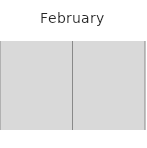
| Category | 1 | Fill 1 | 2 | Fill 2 | 3 | Fill 3 | 4 | Fill 4 | 5 | Fill 5 | 6 | Fill 6 | 7 | Fill 7 | 8 | Fill 8 | 9 | Fill 9 | 10 | Fill 10 | 11 | Fill 11 | 12 | Fill 12 | 13 | Fill 13 | 14 | Fill 14 | 15 | Fill 15 | 16 | Fill 16 | 17 | Fill 17 | 18 | Fill 18 | 19 | Fill 19 | 20 | Fill 20 | 21 | Fill 21 | 22 | Fill 22 | 23 | Fill 23 | 24 | Fill 24 | 25 | Fill 25 | 26 | Fill 26 | 27 | Fill 27 | 28 | Fill 28 |
|---|---|---|---|---|---|---|---|---|---|---|---|---|---|---|---|---|---|---|---|---|---|---|---|---|---|---|---|---|---|---|---|---|---|---|---|---|---|---|---|---|---|---|---|---|---|---|---|---|---|---|---|---|---|---|---|---|
| R | 0 | 1 | 0 | 1 | 0 | 1 | 0 | 1 | 0 | 1 | 0 | 1 | 0 | 1 | 0 | 1 | 0 | 1 | 0 | 1 | 0 | 1 | 0 | 1 | 0 | 1 | 0 | 1 | 0 | 1 | 0 | 1 | 0 | 1 | 0 | 1 | 0 | 1 | 0 | 1 | 0 | 1 | 0 | 1 | 0 | 1 | 0 | 1 | 0 | 1 | 0 | 1 | 0 | 1 | 0 | 1 |
| M | 0 | 1 | 0 | 1 | 0 | 1 | 0 | 1 | 0 | 1 | 0 | 1 | 0 | 1 | 0 | 1 | 0 | 1 | 0 | 1 | 0 | 1 | 0 | 1 | 0 | 1 | 0 | 1 | 0 | 1 | 0 | 1 | 0 | 1 | 0 | 1 | 0 | 1 | 0 | 1 | 0 | 1 | 0 | 1 | 0 | 1 | 0 | 1 | 0 | 1 | 0 | 1 | 0 | 1 | 0 | 1 |
| U1 | 0 | 1 | 0 | 1 | 0 | 1 | 0 | 1 | 0 | 1 | 0 | 1 | 0 | 1 | 0 | 1 | 0 | 1 | 0 | 1 | 0 | 1 | 0 | 1 | 0 | 1 | 0 | 1 | 0 | 1 | 0 | 1 | 0 | 1 | 0 | 1 | 0 | 1 | 0 | 1 | 0 | 1 | 0 | 1 | 0 | 1 | 0 | 1 | 0 | 1 | 0 | 1 | 0 | 1 | 0 | 1 |
| U2 | 0 | 1 | 0 | 1 | 0 | 1 | 0 | 1 | 0 | 1 | 0 | 1 | 0 | 1 | 0 | 1 | 0 | 1 | 0 | 1 | 0 | 1 | 0 | 1 | 0 | 1 | 0 | 1 | 0 | 1 | 0 | 1 | 0 | 1 | 0 | 1 | 0 | 1 | 0 | 1 | 0 | 1 | 0 | 1 | 0 | 1 | 0 | 1 | 0 | 1 | 0 | 1 | 0 | 1 | 0 | 1 |
| U3 | 0 | 1 | 0 | 1 | 0 | 1 | 0 | 1 | 0 | 1 | 0 | 1 | 0 | 1 | 0 | 1 | 0 | 1 | 0 | 1 | 0 | 1 | 0 | 1 | 0 | 1 | 0 | 1 | 0 | 1 | 0 | 1 | 0 | 1 | 0 | 1 | 0 | 1 | 0 | 1 | 0 | 1 | 0 | 1 | 0 | 1 | 0 | 1 | 0 | 1 | 0 | 1 | 0 | 1 | 0 | 1 |